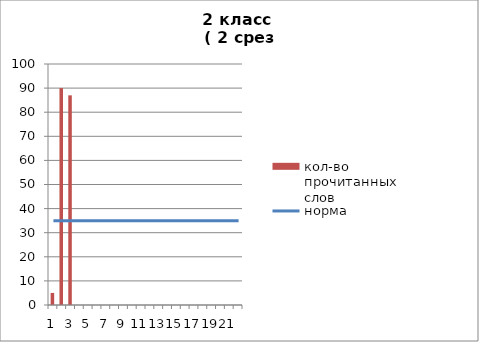
| Category | кол-во прочитанных слов |
|---|---|
| 0 | 5 |
| 1 | 90 |
| 2 | 87 |
| 3 | 0 |
| 4 | 0 |
| 5 | 0 |
| 6 | 0 |
| 7 | 0 |
| 8 | 0 |
| 9 | 0 |
| 10 | 0 |
| 11 | 0 |
| 12 | 0 |
| 13 | 0 |
| 14 | 0 |
| 15 | 0 |
| 16 | 0 |
| 17 | 0 |
| 18 | 0 |
| 19 | 0 |
| 20 | 0 |
| 21 | 0 |